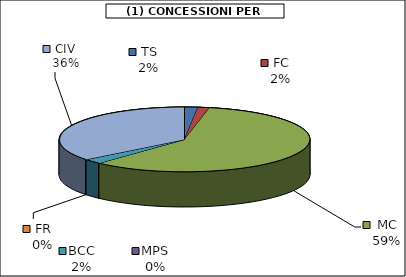
| Category | Series 0 |
|---|---|
| TS | 1405 |
| FC | 1229.125 |
| MC | 48093.5 |
| MPS | 0 |
| BCC | 1995 |
| FR | 0 |
| CIV | 29186.5 |